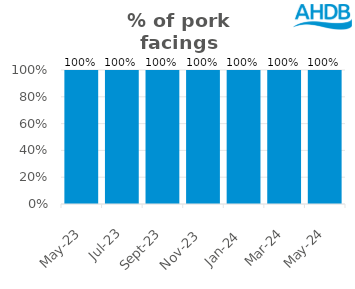
| Category | Pork |
|---|---|
| 2023-05-01 | 1 |
| 2023-07-01 | 1 |
| 2023-09-01 | 1 |
| 2023-11-01 | 1 |
| 2024-01-01 | 1 |
| 2024-03-01 | 1 |
| 2024-05-01 | 1 |